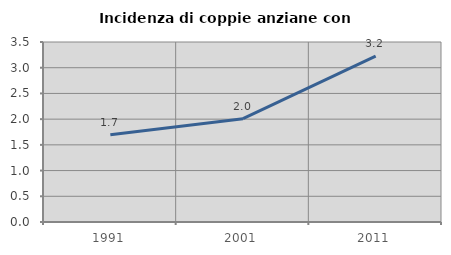
| Category | Incidenza di coppie anziane con figli |
|---|---|
| 1991.0 | 1.697 |
| 2001.0 | 2.009 |
| 2011.0 | 3.226 |